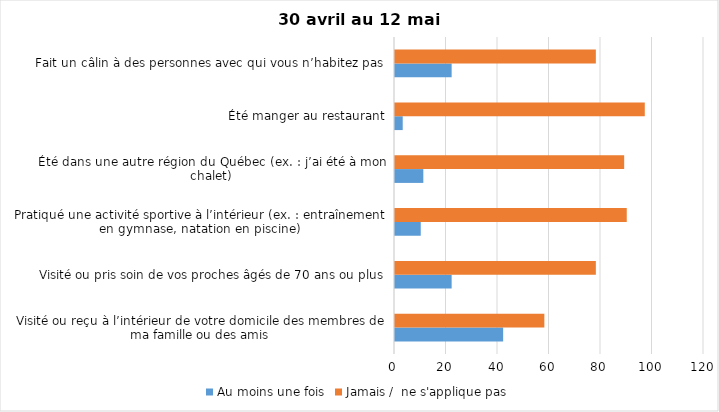
| Category | Au moins une fois | Jamais /  ne s'applique pas |
|---|---|---|
| Visité ou reçu à l’intérieur de votre domicile des membres de ma famille ou des amis | 42 | 58 |
| Visité ou pris soin de vos proches âgés de 70 ans ou plus | 22 | 78 |
| Pratiqué une activité sportive à l’intérieur (ex. : entraînement en gymnase, natation en piscine) | 10 | 90 |
| Été dans une autre région du Québec (ex. : j’ai été à mon chalet) | 11 | 89 |
| Été manger au restaurant | 3 | 97 |
| Fait un câlin à des personnes avec qui vous n’habitez pas | 22 | 78 |